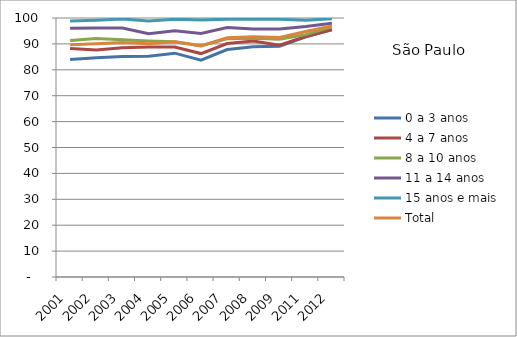
| Category | 0 a 3 anos | 4 a 7 anos | 8 a 10 anos | 11 a 14 anos | 15 anos e mais | Total |
|---|---|---|---|---|---|---|
| 2001.0 | 83.97 | 88.25 | 91.31 | 96.09 | 98.82 | 89.64 |
| 2002.0 | 84.65 | 87.69 | 92.1 | 96.12 | 99.12 | 90.03 |
| 2003.0 | 85.14 | 88.51 | 91.59 | 96.1 | 99.63 | 90.53 |
| 2004.0 | 85.22 | 88.81 | 91.11 | 93.92 | 98.82 | 90.05 |
| 2005.0 | 86.42 | 88.79 | 90.82 | 95.09 | 99.52 | 90.82 |
| 2006.0 | 83.7 | 86.27 | 89.31 | 94 | 99.25 | 89.21 |
| 2007.0 | 87.83 | 90.14 | 91.96 | 96.3 | 99.53 | 92.38 |
| 2008.0 | 88.89 | 91.14 | 92.17 | 95.78 | 99.65 | 92.8 |
| 2009.0 | 89.12 | 89.47 | 91.79 | 95.74 | 99.49 | 92.48 |
| 2011.0 | 92.7 | 92.87 | 93.57 | 96.73 | 99.15 | 94.8 |
| 2012.0 | 95.41 | 95.57 | 96.57 | 98.01 | 99.69 | 96.93 |